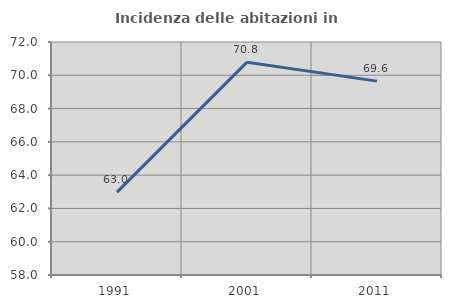
| Category | Incidenza delle abitazioni in proprietà  |
|---|---|
| 1991.0 | 62.982 |
| 2001.0 | 70.789 |
| 2011.0 | 69.65 |